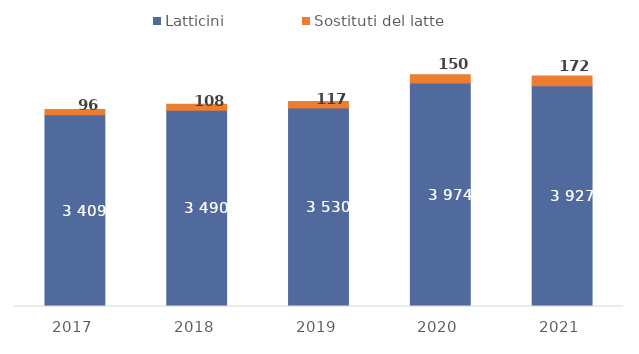
| Category | Latticini | Sostituti del latte |
|---|---|---|
| 2017 | 3408.524 | 95.908 |
| 2018 | 3490.403 | 108.106 |
| 2019 | 3530.149 | 116.953 |
| 2020 | 3973.887 | 150.225 |
| 2021 | 3927.355 | 171.922 |